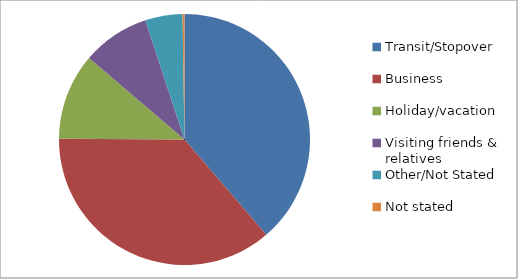
| Category | Series 0 |
|---|---|
| Transit/Stopover | 1232 |
| Business | 1158 |
| Holiday/vacation | 355 |
| Visiting friends & relatives  | 277 |
| Other/Not Stated | 153 |
| Not stated | 8 |